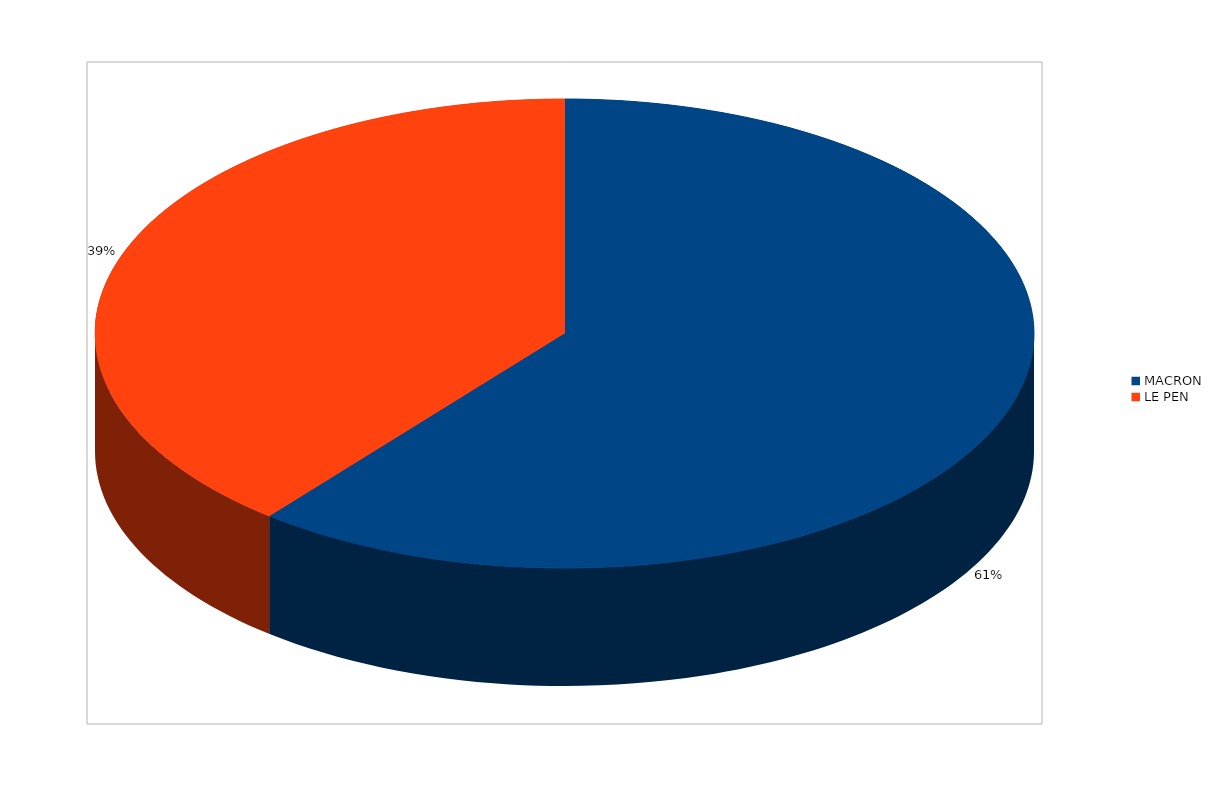
| Category | Series 0 |
|---|---|
| MACRON | 3162 |
| LE PEN | 2038 |